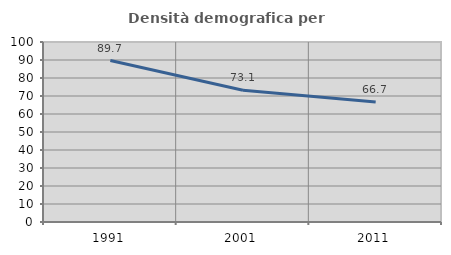
| Category | Densità demografica |
|---|---|
| 1991.0 | 89.719 |
| 2001.0 | 73.149 |
| 2011.0 | 66.683 |